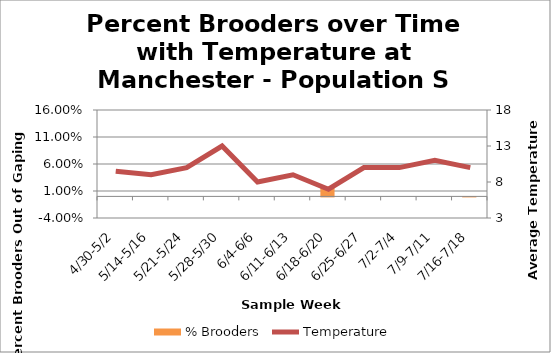
| Category | % Brooders |
|---|---|
| 4/30-5/2 | 0 |
| 5/14-5/16 | 0 |
| 5/21-5/24 | 0 |
| 5/28-5/30 | 0 |
| 6/4-6/6 | 0 |
| 6/11-6/13 | 0 |
| 6/18-6/20 | 0.018 |
| 6/25-6/27 | 0 |
| 7/2-7/4 | 0 |
| 7/9-7/11 | 0 |
| 7/16-7/18 | 0 |